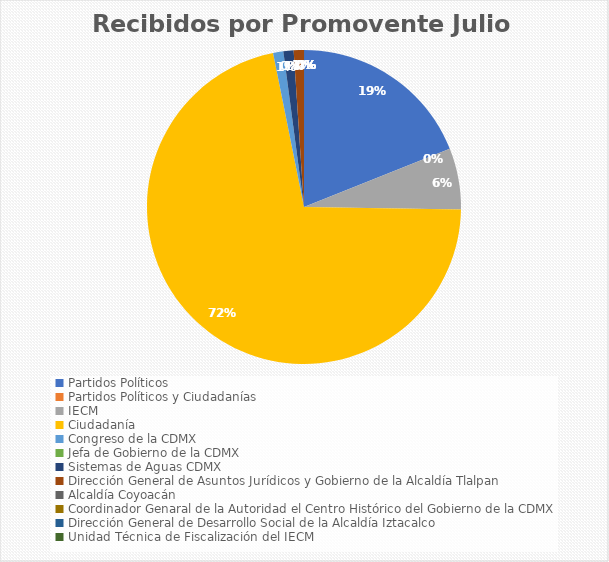
| Category | Recibidos por Promovente Julio |
|---|---|
| Partidos Políticos | 18 |
| Partidos Políticos y Ciudadanías | 0 |
| IECM | 6 |
| Ciudadanía  | 68 |
| Congreso de la CDMX | 1 |
| Jefa de Gobierno de la CDMX | 0 |
| Sistemas de Aguas CDMX | 1 |
| Dirección General de Asuntos Jurídicos y Gobierno de la Alcaldía Tlalpan | 1 |
| Alcaldía Coyoacán | 0 |
| Coordinador Genaral de la Autoridad el Centro Histórico del Gobierno de la CDMX | 0 |
| Dirección General de Desarrollo Social de la Alcaldía Iztacalco | 0 |
| Unidad Técnica de Fiscalización del IECM | 0 |